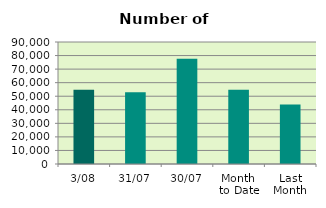
| Category | Series 0 |
|---|---|
| 3/08 | 54714 |
| 31/07 | 52852 |
| 30/07 | 77592 |
| Month 
to Date | 54714 |
| Last
Month | 43867.217 |